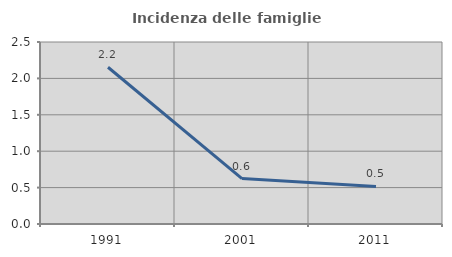
| Category | Incidenza delle famiglie numerose |
|---|---|
| 1991.0 | 2.153 |
| 2001.0 | 0.624 |
| 2011.0 | 0.515 |